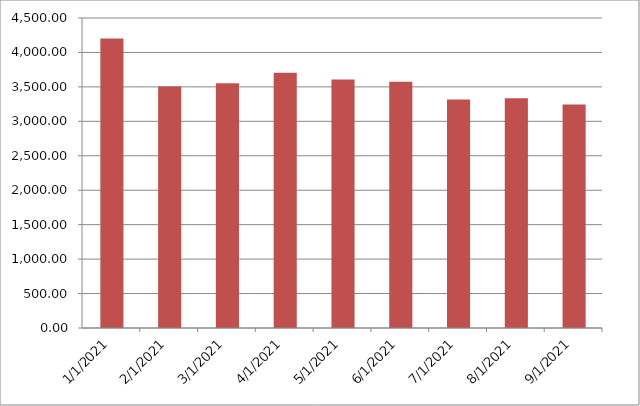
| Category | Series 0 | Series 1 |
|---|---|---|
| 1/1/21 |  | 4203.67 |
| 2/1/21 |  | 3507.15 |
| 3/1/21 |  | 3553.9 |
| 4/1/21 |  | 3705.71 |
| 5/1/21 |  | 3605.98 |
| 6/1/21 |  | 3573.37 |
| 7/1/21 |  | 3315.51 |
| 8/1/21 |  | 3333.73 |
| 9/1/21 |  | 3246.08 |